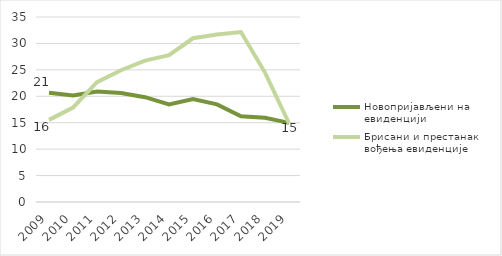
| Category | Новопријављени на евиденцији | Брисани и престанак вођења евиденције |
|---|---|---|
| 2009.0 | 20.663 | 15.54 |
| 2010.0 | 20.152 | 17.858 |
| 2011.0 | 20.909 | 22.66 |
| 2012.0 | 20.629 | 24.928 |
| 2013.0 | 19.833 | 26.742 |
| 2014.0 | 18.475 | 27.788 |
| 2015.0 | 19.468 | 30.98 |
| 2016.0 | 18.469 | 31.67 |
| 2017.0 | 16.227 | 32.158 |
| 2018.0 | 15.939 | 24.483 |
| 2019.0 | 14.973 | 14.898 |